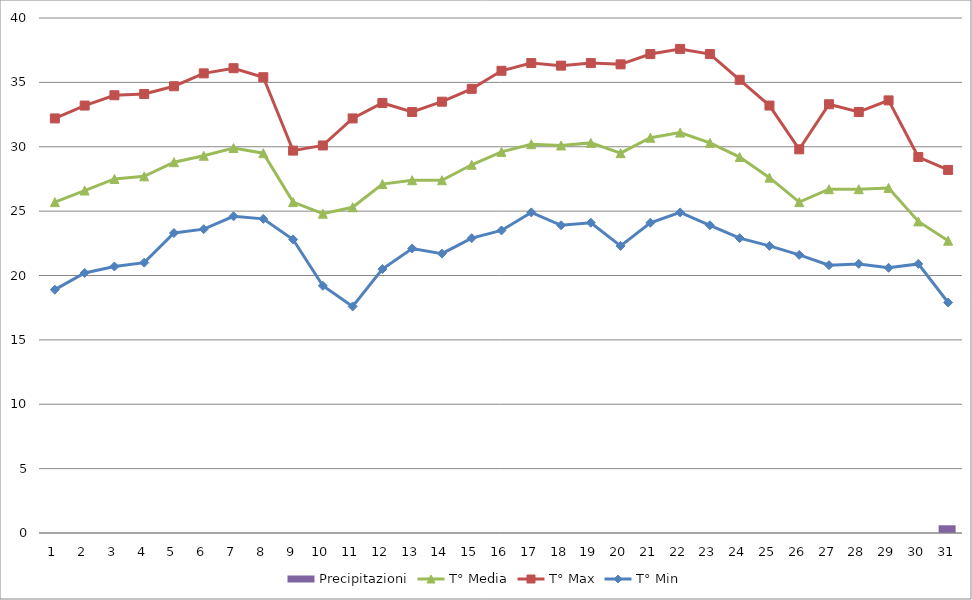
| Category | Precipitazioni |
|---|---|
| 0 | 0 |
| 1 | 0 |
| 2 | 0 |
| 3 | 0 |
| 4 | 0 |
| 5 | 0 |
| 6 | 0 |
| 7 | 0 |
| 8 | 0 |
| 9 | 0 |
| 10 | 0 |
| 11 | 0 |
| 12 | 0 |
| 13 | 0 |
| 14 | 0 |
| 15 | 0 |
| 16 | 0 |
| 17 | 0 |
| 18 | 0 |
| 19 | 0 |
| 20 | 0 |
| 21 | 0 |
| 22 | 0 |
| 23 | 0 |
| 24 | 0 |
| 25 | 0 |
| 26 | 0 |
| 27 | 0 |
| 28 | 0 |
| 29 | 0 |
| 30 | 0.6 |